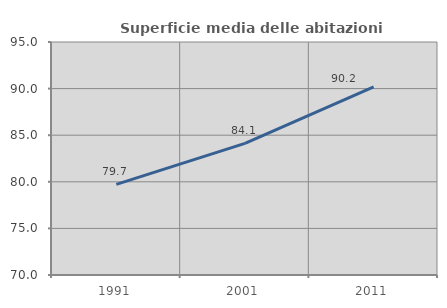
| Category | Superficie media delle abitazioni occupate |
|---|---|
| 1991.0 | 79.721 |
| 2001.0 | 84.123 |
| 2011.0 | 90.177 |